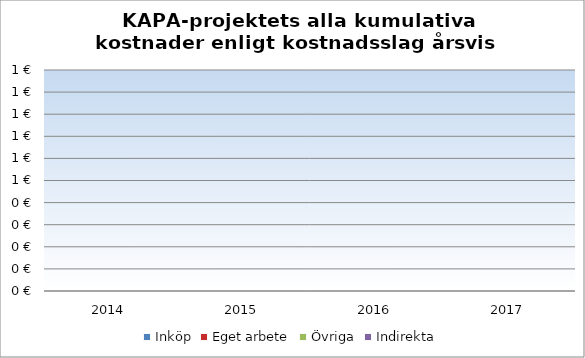
| Category | Inköp | Eget arbete | Övriga | Indirekta |
|---|---|---|---|---|
| 2014.0 | 0 | 0 | 0 | 0 |
| 2015.0 | 0 | 0 | 0 | 0 |
| 2016.0 | 0 | 0 | 0 | 0 |
| 2017.0 | 0 | 0 | 0 | 0 |